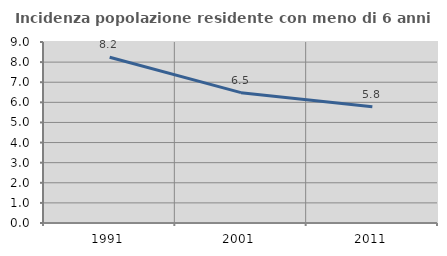
| Category | Incidenza popolazione residente con meno di 6 anni |
|---|---|
| 1991.0 | 8.241 |
| 2001.0 | 6.481 |
| 2011.0 | 5.785 |